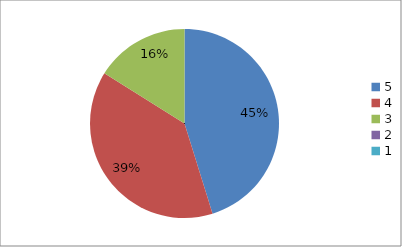
| Category | Series 0 | Series 1 |
|---|---|---|
| 5.0 | 45.2 | 45.2 |
| 4.0 | 38.7 | 38.7 |
| 3.0 | 16.1 | 16.1 |
| 2.0 | 0 | 0 |
| 1.0 | 0 | 0 |